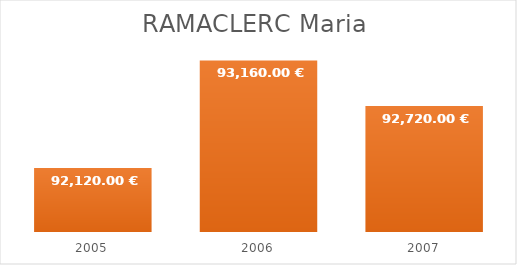
| Category | RAMACLERC Maria |
|---|---|
| 2005.0 | 92120 |
| 2006.0 | 93160 |
| 2007.0 | 92720 |